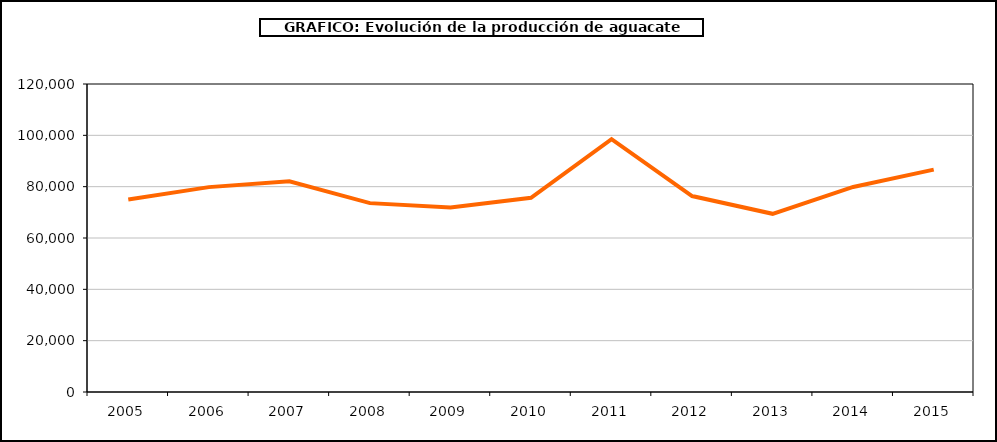
| Category | producción aguacate |
|---|---|
| 2005.0 | 74994 |
| 2006.0 | 79824 |
| 2007.0 | 82116 |
| 2008.0 | 73585 |
| 2009.0 | 71931 |
| 2010.0 | 75655 |
| 2011.0 | 98535 |
| 2012.0 | 76337 |
| 2013.0 | 69427 |
| 2014.0 | 79886 |
| 2015.0 | 86636 |